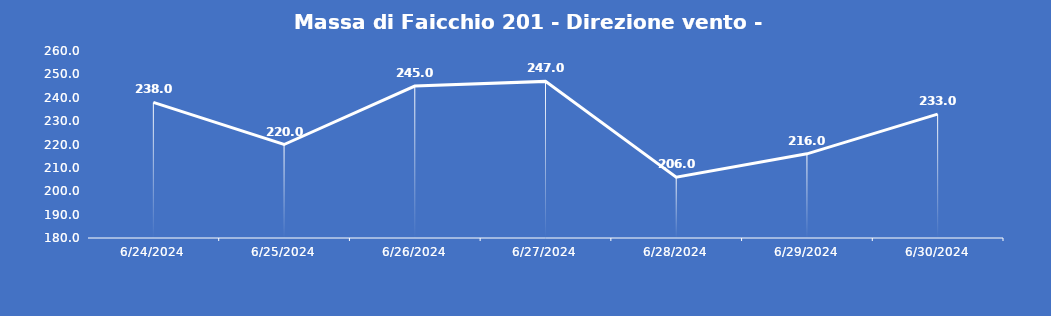
| Category | Massa di Faicchio 201 - Direzione vento - Grezzo (°N) |
|---|---|
| 6/24/24 | 238 |
| 6/25/24 | 220 |
| 6/26/24 | 245 |
| 6/27/24 | 247 |
| 6/28/24 | 206 |
| 6/29/24 | 216 |
| 6/30/24 | 233 |